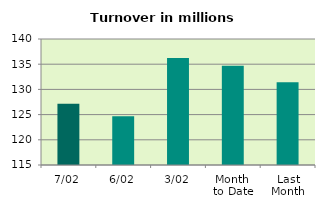
| Category | Series 0 |
|---|---|
| 7/02 | 127.148 |
| 6/02 | 124.695 |
| 3/02 | 136.228 |
| Month 
to Date | 134.712 |
| Last
Month | 131.402 |